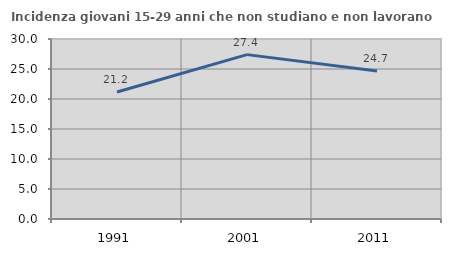
| Category | Incidenza giovani 15-29 anni che non studiano e non lavorano  |
|---|---|
| 1991.0 | 21.16 |
| 2001.0 | 27.397 |
| 2011.0 | 24.675 |